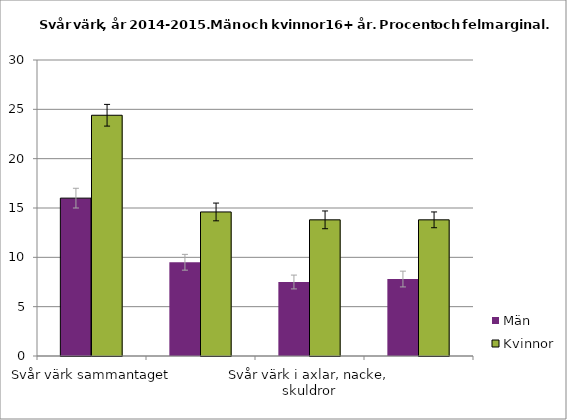
| Category | Män | Kvinnor |
|---|---|---|
| Svår värk sammantaget
 | 16 | 24.4 |
| Svår värk i rygg, höft
 | 9.5 | 14.6 |
| Svår värk i axlar, nacke, skuldror
 | 7.5 | 13.8 |
| Svår värk i armar, händer, ben, fötter | 7.8 | 13.8 |